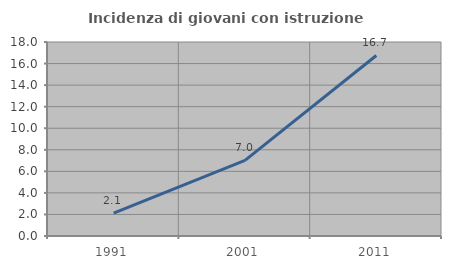
| Category | Incidenza di giovani con istruzione universitaria |
|---|---|
| 1991.0 | 2.128 |
| 2001.0 | 7.011 |
| 2011.0 | 16.749 |